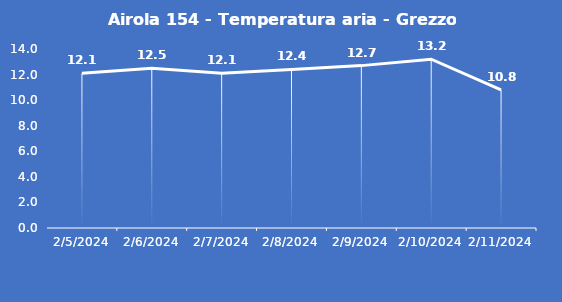
| Category | Airola 154 - Temperatura aria - Grezzo (°C) |
|---|---|
| 2/5/24 | 12.1 |
| 2/6/24 | 12.5 |
| 2/7/24 | 12.1 |
| 2/8/24 | 12.4 |
| 2/9/24 | 12.7 |
| 2/10/24 | 13.2 |
| 2/11/24 | 10.8 |